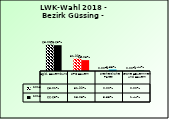
| Category | 2013 | 2018 |
|---|---|---|
| Bgld. Bauernbund | 0.68 | 0.666 |
| SPÖ Bauern | 0.32 | 0.281 |
| Freiheitliche Partei | 0 | 0.038 |
| Grüne Bäuerinnen und Bauern | 0 | 0.014 |